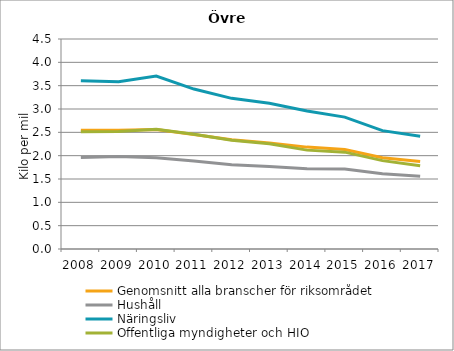
| Category | Genomsnitt alla branscher för riksområdet | Hushåll | Näringsliv | Offentliga myndigheter och HIO |
|---|---|---|---|---|
| 2008 | 2.546 | 1.961 | 3.607 | 2.514 |
| 2009 | 2.545 | 1.984 | 3.584 | 2.518 |
| 2010 | 2.563 | 1.958 | 3.707 | 2.567 |
| 2011 | 2.455 | 1.885 | 3.427 | 2.46 |
| 2012 | 2.339 | 1.805 | 3.229 | 2.329 |
| 2013 | 2.273 | 1.77 | 3.121 | 2.253 |
| 2014 | 2.183 | 1.721 | 2.958 | 2.119 |
| 2015 | 2.131 | 1.713 | 2.826 | 2.076 |
| 2016 | 1.957 | 1.614 | 2.536 | 1.894 |
| 2017 | 1.874 | 1.558 | 2.418 | 1.782 |